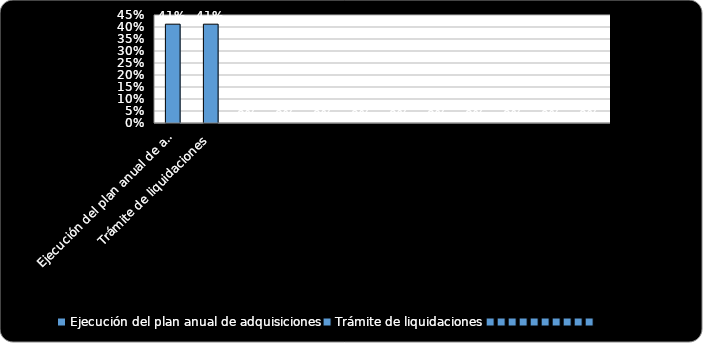
| Category | % Cumplimiento  |
|---|---|
| Ejecución del plan anual de adquisiciones | 0.412 |
| Trámite de liquidaciones | 0.412 |